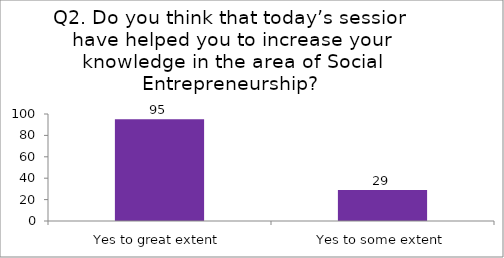
| Category | Q2. Do you think that today’s session have helped you to increase your knowledge in the area of Social Entrepreneurship? |
|---|---|
| Yes to great extent | 95 |
| Yes to some extent | 29 |